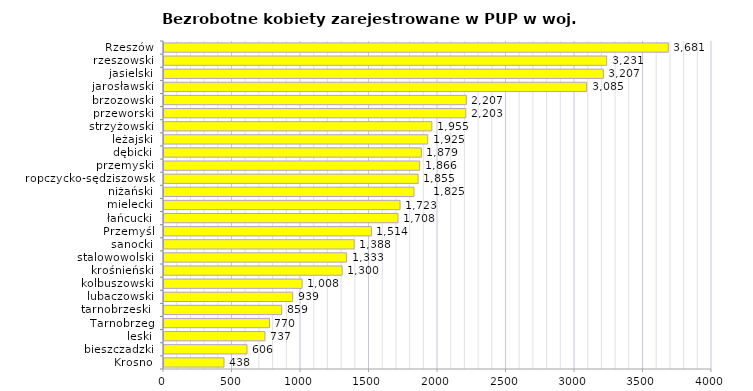
| Category | Bezrobotne kobiety zarejestrowane w PUP w woj. podkarpackim |
|---|---|
| Krosno | 438 |
| bieszczadzki | 606 |
| leski | 737 |
| Tarnobrzeg | 770 |
| tarnobrzeski  | 859 |
| lubaczowski | 939 |
| kolbuszowski | 1008 |
| krośnieński | 1300 |
| stalowowolski | 1333 |
| sanocki | 1388 |
| Przemyśl | 1514 |
| łańcucki | 1708 |
| mielecki | 1723 |
| niżański | 1825 |
| ropczycko-sędziszowski | 1855 |
| przemyski | 1866 |
| dębicki | 1879 |
| leżajski | 1925 |
| strzyżowski | 1955 |
| przeworski | 2203 |
| brzozowski | 2207 |
| jarosławski | 3085 |
| jasielski | 3207 |
| rzeszowski | 3231 |
| Rzeszów | 3681 |